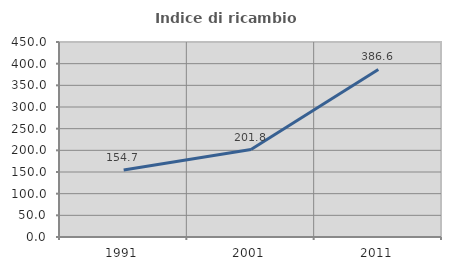
| Category | Indice di ricambio occupazionale  |
|---|---|
| 1991.0 | 154.706 |
| 2001.0 | 201.798 |
| 2011.0 | 386.592 |